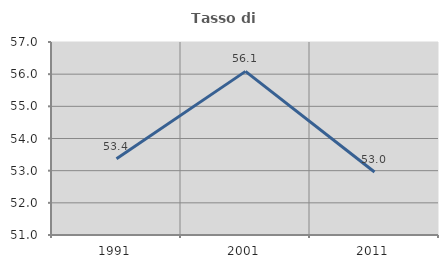
| Category | Tasso di occupazione   |
|---|---|
| 1991.0 | 53.368 |
| 2001.0 | 56.087 |
| 2011.0 | 52.96 |